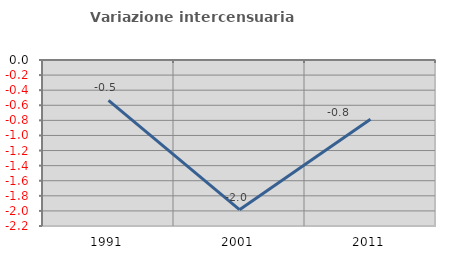
| Category | Variazione intercensuaria annua |
|---|---|
| 1991.0 | -0.536 |
| 2001.0 | -1.984 |
| 2011.0 | -0.786 |